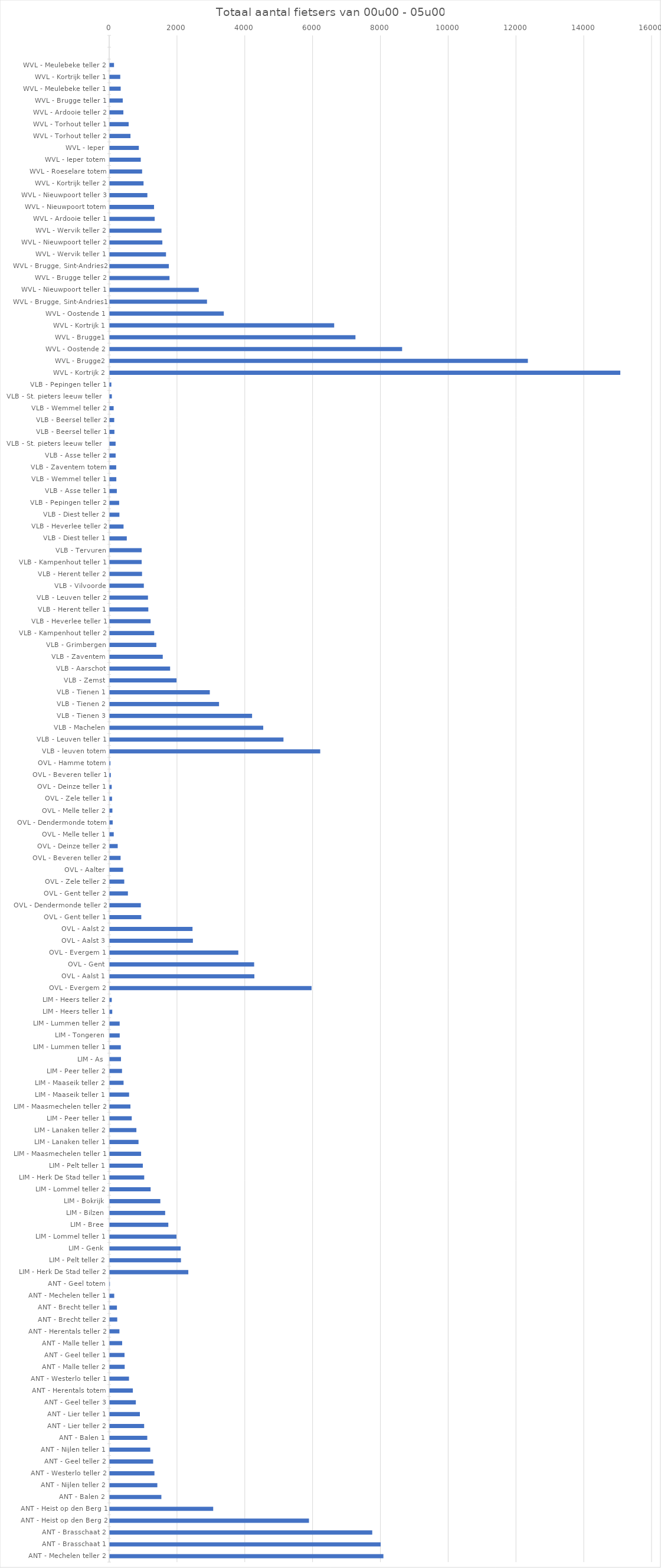
| Category | Grand Total |
|---|---|
| ANT - Mechelen teller 2 | 8072 |
| ANT - Brasschaat 1 | 7992 |
| ANT - Brasschaat 2 | 7743 |
| ANT - Heist op den Berg 2 | 5876 |
| ANT - Heist op den Berg 1 | 3051 |
| ANT - Balen 2 | 1522 |
| ANT - Nijlen teller 2 | 1403 |
| ANT - Westerlo teller 2 | 1318 |
| ANT - Geel teller 2 | 1279 |
| ANT - Nijlen teller 1 | 1194 |
| ANT - Balen 1 | 1106 |
| ANT - Lier teller 2 | 1014 |
| ANT - Lier teller 1 | 888 |
| ANT - Geel teller 3 | 769 |
| ANT - Herentals totem | 681 |
| ANT - Westerlo teller 1 | 567 |
| ANT - Malle teller 2 | 440 |
| ANT - Geel teller 1 | 435 |
| ANT - Malle teller 1 | 366 |
| ANT - Herentals teller 2 | 285 |
| ANT - Brecht teller 2 | 220 |
| ANT - Brecht teller 1 | 211 |
| ANT - Mechelen teller 1 | 131 |
| ANT - Geel totem | 4 |
| LIM - Herk De Stad teller 2 | 2317 |
| LIM - Pelt teller 2 | 2100 |
| LIM - Genk | 2091 |
| LIM - Lommel teller 1 | 1967 |
| LIM - Bree | 1727 |
| LIM - Bilzen | 1634 |
| LIM - Bokrijk | 1491 |
| LIM - Lommel teller 2 | 1205 |
| LIM - Herk De Stad teller 1 | 1016 |
| LIM - Pelt teller 1 | 975 |
| LIM - Maasmechelen teller 1 | 924 |
| LIM - Lanaken teller 1 | 848 |
| LIM - Lanaken teller 2 | 785 |
| LIM - Peer teller 1 | 648 |
| LIM - Maasmechelen teller 2 | 609 |
| LIM - Maaseik teller 1 | 570 |
| LIM - Maaseik teller 2 | 407 |
| LIM - Peer teller 2 | 361 |
| LIM - As | 331 |
| LIM - Lummen teller 1 | 326 |
| LIM - Tongeren | 293 |
| LIM - Lummen teller 2 | 292 |
| LIM - Heers teller 1 | 73 |
| LIM - Heers teller 2 | 59 |
| OVL - Evergem 2 | 5953 |
| OVL - Aalst 1 | 4266 |
| OVL - Gent | 4259 |
| OVL - Evergem 1 | 3792 |
| OVL - Aalst 3 | 2452 |
| OVL - Aalst 2 | 2441 |
| OVL - Gent teller 1 | 929 |
| OVL - Dendermonde teller 2 | 917 |
| OVL - Gent teller 2 | 535 |
| OVL - Zele teller 2 | 427 |
| OVL - Aalter | 393 |
| OVL - Beveren teller 2 | 319 |
| OVL - Deinze teller 2 | 234 |
| OVL - Melle teller 1 | 117 |
| OVL - Dendermonde totem | 86 |
| OVL - Melle teller 2 | 77 |
| OVL - Zele teller 1 | 67 |
| OVL - Deinze teller 1 | 57 |
| OVL - Beveren teller 1 | 31 |
| OVL - Hamme totem | 19 |
| VLB - leuven totem | 6208 |
| VLB - Leuven teller 1 | 5124 |
| VLB - Machelen | 4527 |
| VLB - Tienen 3 | 4198 |
| VLB - Tienen 2 | 3223 |
| VLB - Tienen 1 | 2951 |
| VLB - Zemst | 1969 |
| VLB - Aarschot | 1780 |
| VLB - Zaventem | 1563 |
| VLB - Grimbergen | 1374 |
| VLB - Kampenhout teller 2 | 1310 |
| VLB - Heverlee teller 1 | 1204 |
| VLB - Herent teller 1 | 1137 |
| VLB - Leuven teller 2 | 1127 |
| VLB - Vilvoorde | 1005 |
| VLB - Herent teller 2 | 952 |
| VLB - Kampenhout teller 1 | 941 |
| VLB - Tervuren | 941 |
| VLB - Diest teller 1 | 502 |
| VLB - Heverlee teller 2 | 406 |
| VLB - Diest teller 2 | 284 |
| VLB - Pepingen teller 2 | 277 |
| VLB - Asse teller 1 | 208 |
| VLB - Wemmel teller 1 | 193 |
| VLB - Zaventem totem | 190 |
| VLB - Asse teller 2 | 173 |
| VLB - St. pieters leeuw teller 2 | 172 |
| VLB - Beersel teller 1 | 137 |
| VLB - Beersel teller 2 | 131 |
| VLB - Wemmel teller 2 | 114 |
| VLB - St. pieters leeuw teller 1 | 61 |
| VLB - Pepingen teller 1 | 46 |
| WVL - Kortrijk 2 | 15061 |
| WVL - Brugge2 | 12334 |
| WVL - Oostende 2 | 8624 |
| WVL - Brugge1 | 7248 |
| WVL - Kortrijk 1 | 6620 |
| WVL - Oostende 1 | 3364 |
| WVL - Brugge, Sint-Andries1 | 2868 |
| WVL - Nieuwpoort teller 1 | 2626 |
| WVL - Brugge teller 2 | 1762 |
| WVL - Brugge, Sint-Andries2 | 1743 |
| WVL - Wervik teller 1 | 1659 |
| WVL - Nieuwpoort teller 2 | 1551 |
| WVL - Wervik teller 2 | 1526 |
| WVL - Ardooie teller 1 | 1325 |
| WVL - Nieuwpoort totem | 1306 |
| WVL - Nieuwpoort teller 3 | 1109 |
| WVL - Kortrijk teller 2 | 996 |
| WVL - Roeselare totem | 954 |
| WVL - Ieper totem | 914 |
| WVL - Ieper | 857 |
| WVL - Torhout teller 2 | 610 |
| WVL - Torhout teller 1 | 557 |
| WVL - Ardooie teller 2 | 401 |
| WVL - Brugge teller 1 | 383 |
| WVL - Meulebeke teller 1 | 322 |
| WVL - Kortrijk teller 1 | 309 |
| WVL - Meulebeke teller 2 | 125 |